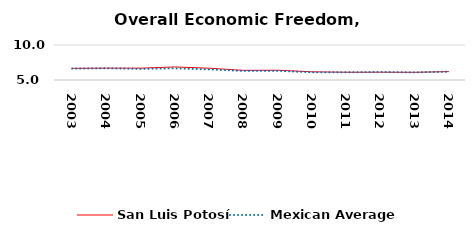
| Category | San Luis Potosí | Mexican Average  |
|---|---|---|
| 2003.0 | 6.667 | 6.632 |
| 2004.0 | 6.696 | 6.678 |
| 2005.0 | 6.696 | 6.582 |
| 2006.0 | 6.864 | 6.668 |
| 2007.0 | 6.681 | 6.508 |
| 2008.0 | 6.377 | 6.3 |
| 2009.0 | 6.397 | 6.3 |
| 2010.0 | 6.172 | 6.105 |
| 2011.0 | 6.108 | 6.103 |
| 2012.0 | 6.115 | 6.144 |
| 2013.0 | 6.102 | 6.087 |
| 2014.0 | 6.196 | 6.195 |